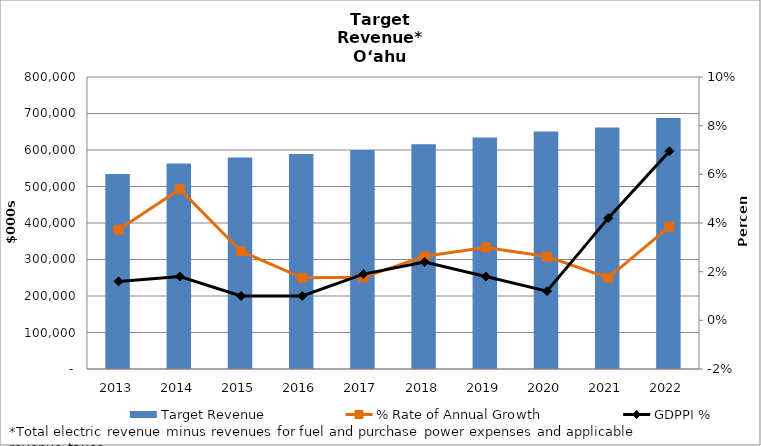
| Category | Target Revenue |
|---|---|
| 2013.0 | 534364.007 |
| 2014.0 | 563164.585 |
| 2015.0 | 579162.593 |
| 2016.0 | 589283.02 |
| 2017.0 | 599695.753 |
| 2018.0 | 615475.268 |
| 2019.0 | 633917.015 |
| 2020.0 | 650526.953 |
| 2021.0 | 661891.535 |
| 2022.0 | 687361.207 |